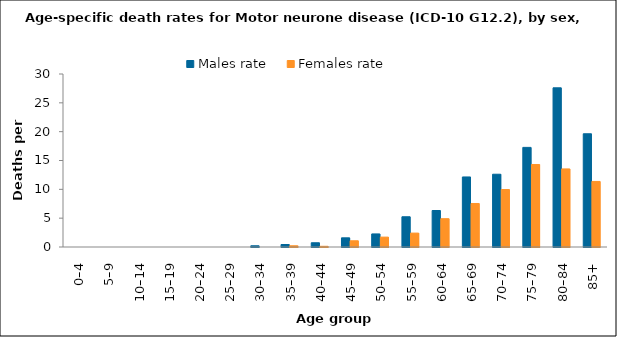
| Category | Males rate | Females rate |
|---|---|---|
| 0–4 | 0 | 0 |
| 5–9 | 0 | 0 |
| 10–14 | 0 | 0 |
| 15–19 | 0 | 0 |
| 20–24 | 0 | 0 |
| 25–29 | 0 | 0 |
| 30–34 | 0.213 | 0 |
| 35–39 | 0.431 | 0.213 |
| 40–44 | 0.735 | 0.119 |
| 45–49 | 1.591 | 1.081 |
| 50–54 | 2.267 | 1.713 |
| 55–59 | 5.246 | 2.411 |
| 60–64 | 6.327 | 4.908 |
| 65–69 | 12.145 | 7.546 |
| 70–74 | 12.62 | 9.965 |
| 75–79 | 17.275 | 14.308 |
| 80–84 | 27.604 | 13.539 |
| 85+ | 19.634 | 11.369 |